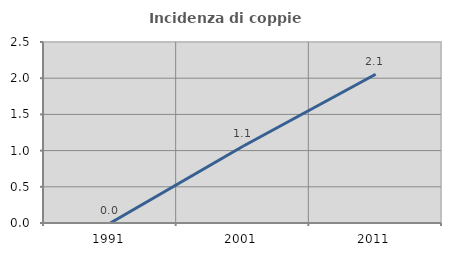
| Category | Incidenza di coppie miste |
|---|---|
| 1991.0 | 0 |
| 2001.0 | 1.06 |
| 2011.0 | 2.055 |